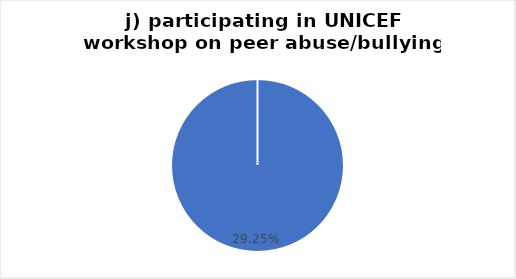
| Category | j) UNICEF workshop on peer abuse/bullying |
|---|---|
| 0 | 0.292 |